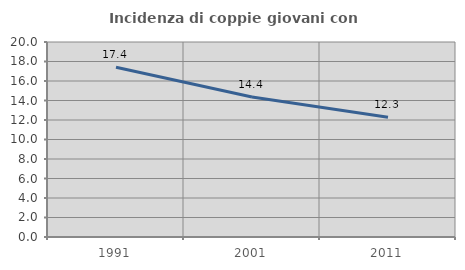
| Category | Incidenza di coppie giovani con figli |
|---|---|
| 1991.0 | 17.41 |
| 2001.0 | 14.353 |
| 2011.0 | 12.271 |